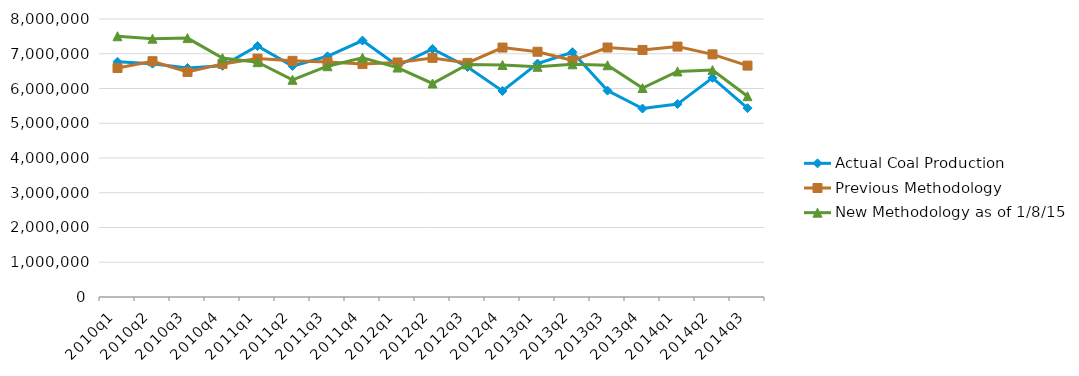
| Category | Actual Coal Production | Previous Methodology | New Methodology as of 1/8/15 |
|---|---|---|---|
| 2010q1 | 6769537 | 6588429 | 7503515 |
| 2010q2 | 6714686 | 6785563 | 7432748 |
| 2010q3 | 6591063 | 6476827 | 7449657 |
| 2010q4 | 6652989 | 6708127 | 6875681 |
| 2011q1 | 7221741 | 6860841 | 6757272 |
| 2011q2 | 6646409 | 6795646 | 6250043 |
| 2011q3 | 6926846 | 6759736 | 6641256 |
| 2011q4 | 7380458 | 6703449 | 6884124 |
| 2012q1 | 6653244 | 6748471 | 6602757 |
| 2012q2 | 7138416 | 6880408 | 6144571 |
| 2012q3 | 6618859 | 6736989 | 6693434 |
| 2012q4 | 5928997 | 7177637 | 6676568 |
| 2013q1 | 6718440 | 7057713 | 6624773 |
| 2013q2 | 7043882 | 6804583 | 6696838 |
| 2013q3 | 5939180 | 7179634 | 6668866 |
| 2013q4 | 5423195 | 7107959 | 6012911 |
| 2014q1 | 5551461 | 7206330 | 6492008 |
| 2014q2 | 6307154 | 6982598 | 6529378 |
| 2014q3 | 5434249 | 6658307 | 5778743 |